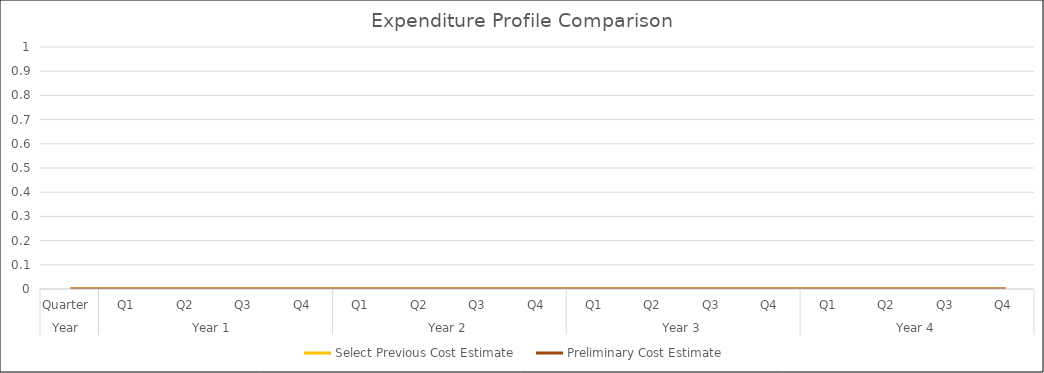
| Category | Select Previous Cost Estimate | Preliminary Cost Estimate |
|---|---|---|
| 0 | 0 | 0 |
| 1 | 0 | 0 |
| 2 | 0 | 0 |
| 3 | 0 | 0 |
| 4 | 0 | 0 |
| 5 | 0 | 0 |
| 6 | 0 | 0 |
| 7 | 0 | 0 |
| 8 | 0 | 0 |
| 9 | 0 | 0 |
| 10 | 0 | 0 |
| 11 | 0 | 0 |
| 12 | 0 | 0 |
| 13 | 0 | 0 |
| 14 | 0 | 0 |
| 15 | 0 | 0 |
| 16 | 0 | 0 |